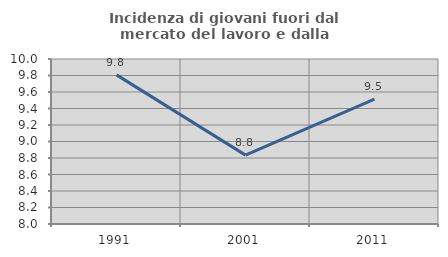
| Category | Incidenza di giovani fuori dal mercato del lavoro e dalla formazione  |
|---|---|
| 1991.0 | 9.807 |
| 2001.0 | 8.835 |
| 2011.0 | 9.513 |